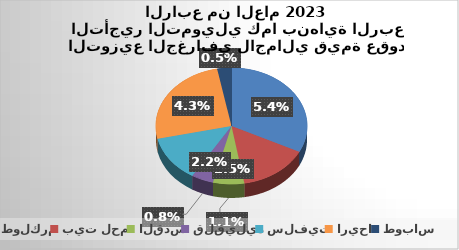
| Category | Series 0 |
|---|---|
| طولكرم | 0.054 |
| بيت لحم  | 0.025 |
| القدس | 0.011 |
| قلقيلية | 0.008 |
| سلفيت | 0.022 |
| اريحا  | 0.043 |
| طوباس | 0.005 |